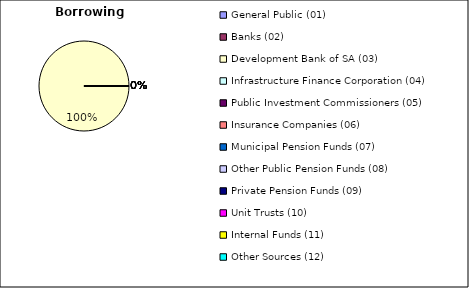
| Category | Borrowing Source |
|---|---|
| General Public (01) | 0 |
| Banks (02) | 0 |
| Development Bank of SA (03) | 6316405.74 |
| Infrastructure Finance Corporation (04) | 0 |
| Public Investment Commissioners (05) | 0 |
| Insurance Companies (06) | 0 |
| Municipal Pension Funds (07) | 0 |
| Other Public Pension Funds (08) | 0 |
| Private Pension Funds (09) | 0 |
| Unit Trusts (10) | 0 |
| Internal Funds (11) | 0 |
| Other Sources (12) | 0 |